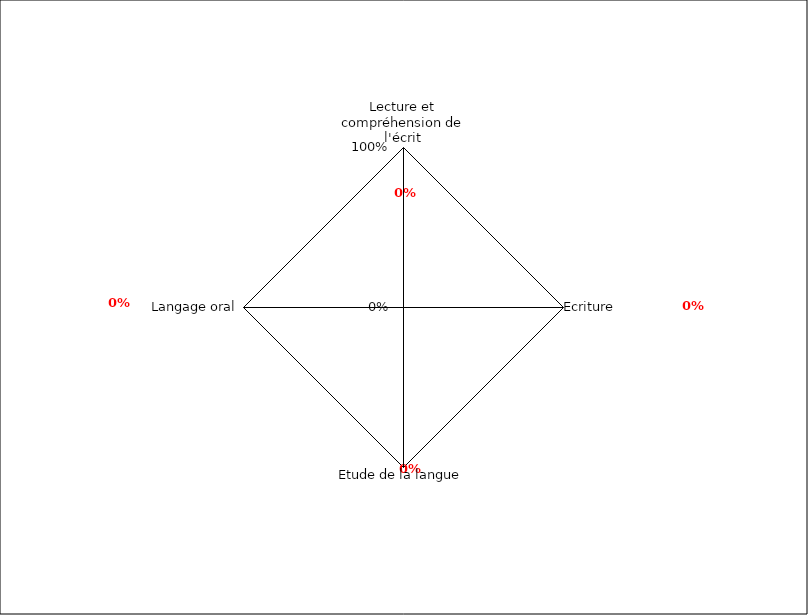
| Category | Series 0 |
|---|---|
| Lecture et compréhension de l'écrit | 0 |
| Ecriture | 0 |
| Etude de la langue | 0 |
| Langage oral | 0 |